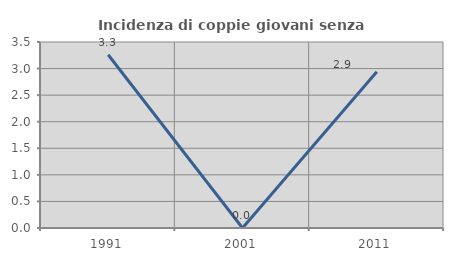
| Category | Incidenza di coppie giovani senza figli |
|---|---|
| 1991.0 | 3.261 |
| 2001.0 | 0 |
| 2011.0 | 2.941 |